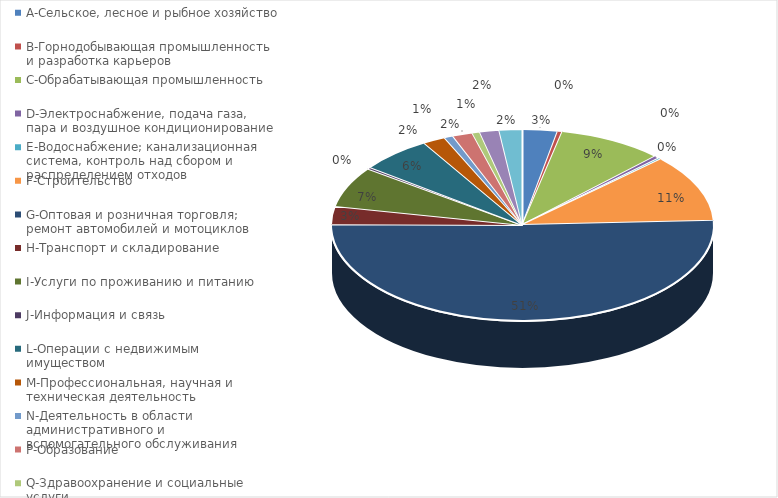
| Category | Series 0 |
|---|---|
| A-Сельское, лесное и рыбное хозяйство | 0.03 |
| B-Горнодобывающая промышленность и разработка карьеров | 0.004 |
| C-Обрабатывающая промышленность | 0.089 |
| D-Электроснабжение, подача газа, пара и воздушное кондиционирование | 0.005 |
| E-Водоснабжение; канализационная система, контроль над сбором и распределением отходов | 0.002 |
| F-Строительство | 0.114 |
| G-Оптовая и розничная торговля; ремонт автомобилей и мотоциклов | 0.508 |
| H-Транспорт и складирование | 0.03 |
| I-Услуги по проживанию и питанию | 0.068 |
| J-Информация и связь | 0.003 |
| L-Операции с недвижимым имуществом | 0.061 |
| M-Профессиональная, научная и техническая деятельность | 0.019 |
| N-Деятельность в области административного и вспомогательного обслуживания | 0.008 |
| P-Образование | 0.017 |
| Q-Здравоохранение и социальные услуги | 0.006 |
| R-Искусство, развлечения и отдых | 0.016 |
| S-Предоставление прочих видов услуг | 0.019 |